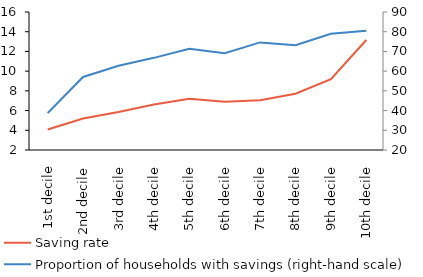
| Category | Saving rate |
|---|---|
| 1st decile | 4.076 |
| 2nd decile | 5.203 |
| 3rd decile | 5.846 |
| 4th decile | 6.613 |
| 5th decile | 7.192 |
| 6th decile | 6.89 |
| 7th decile | 7.059 |
| 8th decile | 7.71 |
| 9th decile | 9.191 |
| 10th decile | 13.159 |